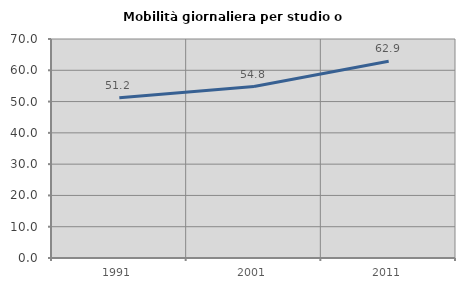
| Category | Mobilità giornaliera per studio o lavoro |
|---|---|
| 1991.0 | 51.215 |
| 2001.0 | 54.812 |
| 2011.0 | 62.897 |